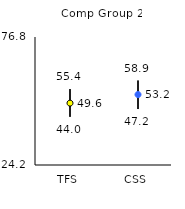
| Category | 25th | 75th | Mean |
|---|---|---|---|
| TFS | 44 | 55.4 | 49.63 |
| CSS | 47.2 | 58.9 | 53.15 |